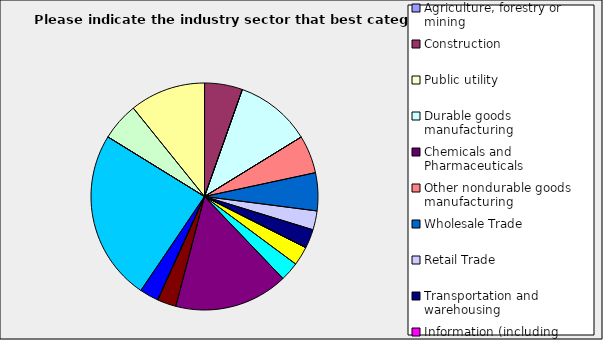
| Category | Series 0 |
|---|---|
| Agriculture, forestry or mining | 0 |
| Construction | 0.054 |
| Public utility | 0 |
| Durable goods manufacturing | 0.108 |
| Chemicals and Pharmaceuticals | 0 |
| Other nondurable goods manufacturing | 0.054 |
| Wholesale Trade | 0.054 |
| Retail Trade | 0.027 |
| Transportation and warehousing | 0.027 |
| Information (including broadcasting and telecommunication) | 0 |
| Finance and Insurance | 0.027 |
| Real Estate | 0.027 |
| Professional, scientific and technical services | 0.162 |
| Consulting | 0.027 |
| Administrative and office services (including waste management) | 0 |
| Education | 0.027 |
| Health Care and social services | 0.243 |
| Arts, entertainment and recreation | 0 |
| Accommodation and food services | 0.054 |
| Other | 0.108 |